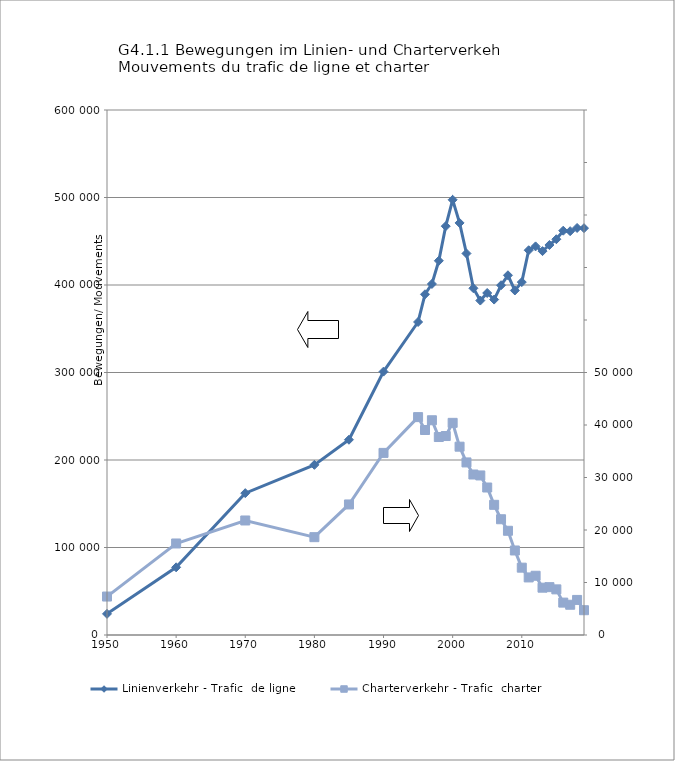
| Category | Linienverkehr - Trafic  de ligne |
|---|---|
| 1950.0 | 24166 |
| 1960.0 | 77337 |
| 1970.0 | 162118 |
| 1980.0 | 194463 |
| 1985.0 | 223154 |
| 1990.0 | 301006 |
| 1995.0 | 357731 |
| 1996.0 | 389383 |
| 1997.0 | 401195 |
| 1998.0 | 427694 |
| 1999.0 | 467220 |
| 2000.0 | 497403 |
| 2001.0 | 470947 |
| 2002.0 | 436018 |
| 2003.0 | 396268 |
| 2004.0 | 382229 |
| 2005.0 | 390862 |
| 2006.0 | 383343 |
| 2007.0 | 399730 |
| 2008.0 | 411090 |
| 2009.0 | 393747 |
| 2010.0 | 403286 |
| 2011.0 | 439725 |
| 2012.0 | 444138 |
| 2013.0 | 438725 |
| 2014.0 | 445723 |
| 2015.0 | 452286 |
| 2016.0 | 462059 |
| 2017.0 | 461501 |
| 2018.0 | 465191 |
| 2019.0 | 464945 |